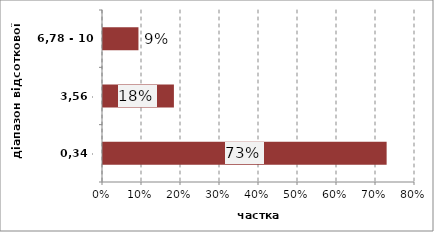
| Category | Series 0 |
|---|---|
| 0,34 - 3,56 | 0.727 |
| 3,56 - 6,78 | 0.182 |
| 6,78 - 10 | 0.091 |